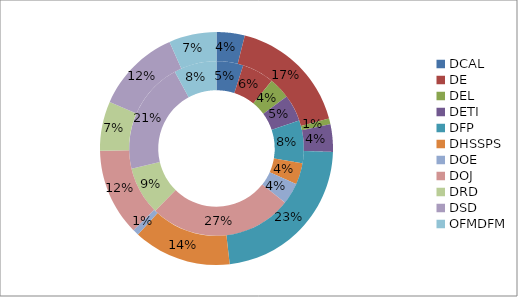
| Category | % Surveys | % Compliance Burden |
|---|---|---|
| DCAL | 0.05 | 0.039 |
| DE | 0.059 | 0.169 |
| DEL | 0.04 | 0.008 |
| DETI | 0.05 | 0.038 |
| DFP | 0.079 | 0.227 |
| DHSSPS | 0.04 | 0.136 |
| DOE | 0.04 | 0.009 |
| DOJ | 0.267 | 0.121 |
| DRD | 0.089 | 0.069 |
| DSD | 0.208 | 0.119 |
| OFMDFM | 0.079 | 0.066 |